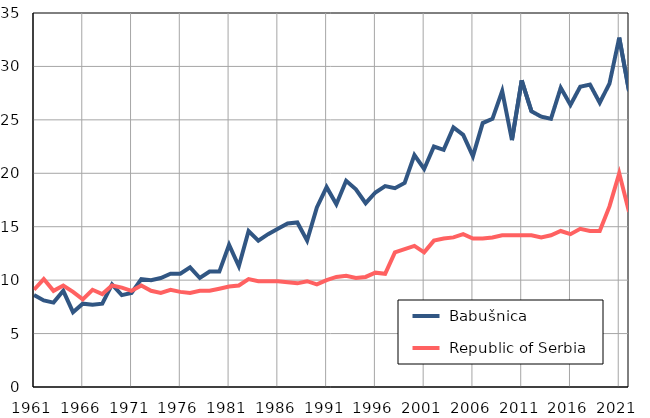
| Category |  Babušnica |  Republic of Serbia |
|---|---|---|
| 1961.0 | 8.6 | 9.1 |
| 1962.0 | 8.1 | 10.1 |
| 1963.0 | 7.9 | 9 |
| 1964.0 | 9 | 9.5 |
| 1965.0 | 7 | 8.9 |
| 1966.0 | 7.8 | 8.2 |
| 1967.0 | 7.7 | 9.1 |
| 1968.0 | 7.8 | 8.7 |
| 1969.0 | 9.6 | 9.5 |
| 1970.0 | 8.6 | 9.3 |
| 1971.0 | 8.8 | 9 |
| 1972.0 | 10.1 | 9.5 |
| 1973.0 | 10 | 9 |
| 1974.0 | 10.2 | 8.8 |
| 1975.0 | 10.6 | 9.1 |
| 1976.0 | 10.6 | 8.9 |
| 1977.0 | 11.2 | 8.8 |
| 1978.0 | 10.2 | 9 |
| 1979.0 | 10.8 | 9 |
| 1980.0 | 10.8 | 9.2 |
| 1981.0 | 13.3 | 9.4 |
| 1982.0 | 11.3 | 9.5 |
| 1983.0 | 14.6 | 10.1 |
| 1984.0 | 13.7 | 9.9 |
| 1985.0 | 14.3 | 9.9 |
| 1986.0 | 14.8 | 9.9 |
| 1987.0 | 15.3 | 9.8 |
| 1988.0 | 15.4 | 9.7 |
| 1989.0 | 13.7 | 9.9 |
| 1990.0 | 16.8 | 9.6 |
| 1991.0 | 18.7 | 10 |
| 1992.0 | 17.1 | 10.3 |
| 1993.0 | 19.3 | 10.4 |
| 1994.0 | 18.5 | 10.2 |
| 1995.0 | 17.2 | 10.3 |
| 1996.0 | 18.2 | 10.7 |
| 1997.0 | 18.8 | 10.6 |
| 1998.0 | 18.6 | 12.6 |
| 1999.0 | 19.1 | 12.9 |
| 2000.0 | 21.7 | 13.2 |
| 2001.0 | 20.4 | 12.6 |
| 2002.0 | 22.5 | 13.7 |
| 2003.0 | 22.2 | 13.9 |
| 2004.0 | 24.3 | 14 |
| 2005.0 | 23.6 | 14.3 |
| 2006.0 | 21.6 | 13.9 |
| 2007.0 | 24.7 | 13.9 |
| 2008.0 | 25.1 | 14 |
| 2009.0 | 27.7 | 14.2 |
| 2010.0 | 23.1 | 14.2 |
| 2011.0 | 28.7 | 14.2 |
| 2012.0 | 25.8 | 14.2 |
| 2013.0 | 25.3 | 14 |
| 2014.0 | 25.1 | 14.2 |
| 2015.0 | 28 | 14.6 |
| 2016.0 | 26.4 | 14.3 |
| 2017.0 | 28.1 | 14.8 |
| 2018.0 | 28.3 | 14.6 |
| 2019.0 | 26.6 | 14.6 |
| 2020.0 | 28.4 | 16.9 |
| 2021.0 | 32.7 | 20 |
| 2022.0 | 27.7 | 16.4 |